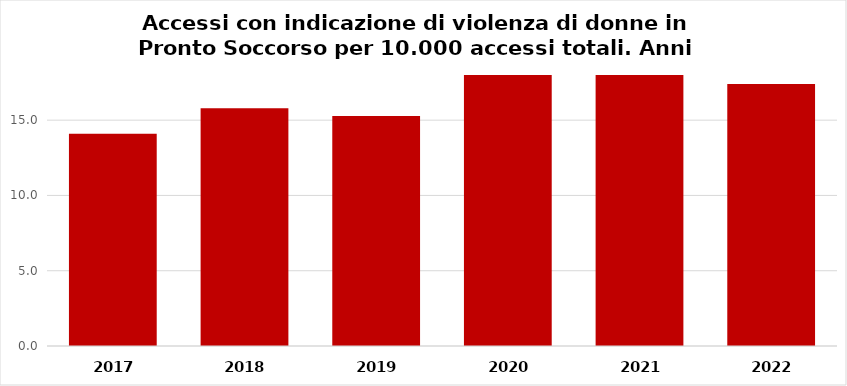
| Category | per 10.000 accessi in PS |
|---|---|
| 2017.0 | 14.1 |
| 2018.0 | 15.79 |
| 2019.0 | 15.28 |
| 2020.0 | 18.54 |
| 2021.0 | 18.41 |
| 2022.0 | 17.4 |